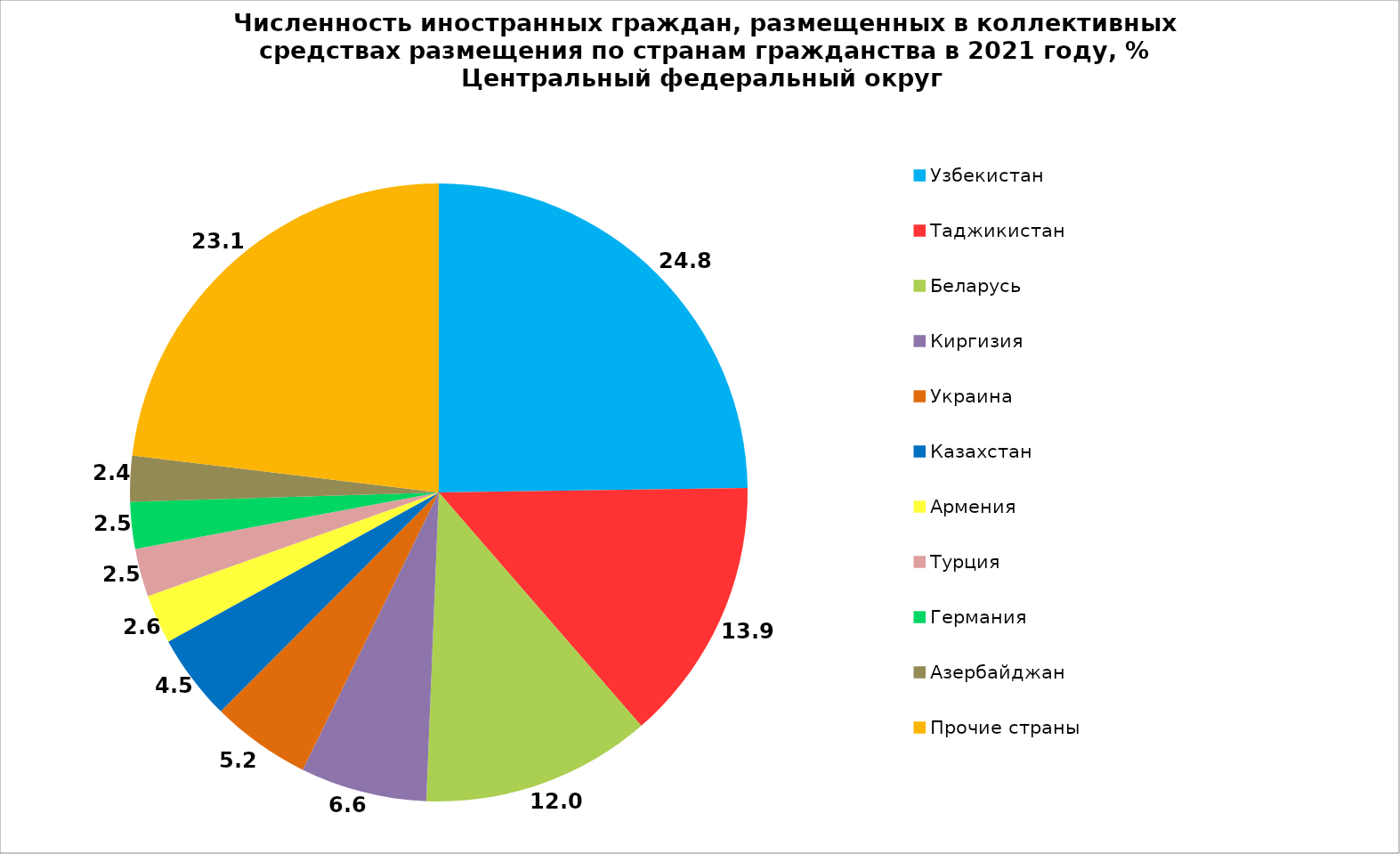
| Category | Series 0 |
|---|---|
| Узбекистан | 24.766 |
| Таджикистан | 13.855 |
| Беларусь | 12.025 |
| Киргизия | 6.62 |
| Украина | 5.202 |
| Казахстан | 4.521 |
| Армения | 2.568 |
| Турция | 2.509 |
| Германия | 2.453 |
| Азербайджан | 2.39 |
| Прочие страны | 23.092 |